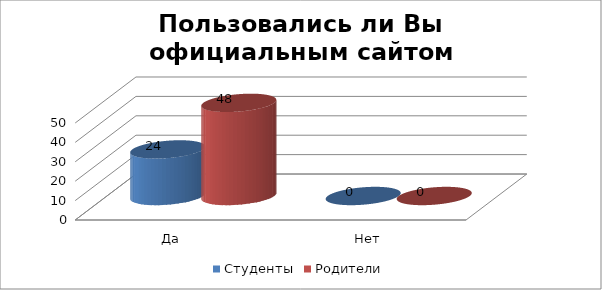
| Category | Студенты | Родители |
|---|---|---|
| Да | 24 | 48 |
| Нет | 0 | 0 |